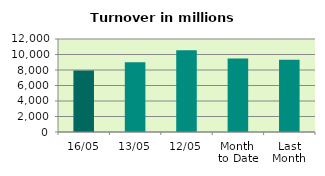
| Category | Series 0 |
|---|---|
| 16/05 | 7946.097 |
| 13/05 | 9010.046 |
| 12/05 | 10549.745 |
| Month 
to Date | 9485.694 |
| Last
Month | 9311.354 |